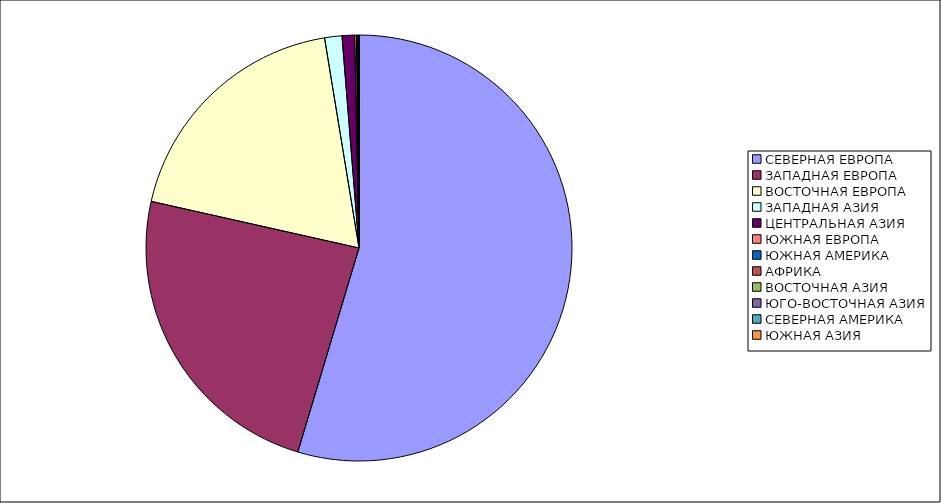
| Category | Оборот |
|---|---|
| СЕВЕРНАЯ ЕВРОПА | 54.639 |
| ЗАПАДНАЯ ЕВРОПА | 23.873 |
| ВОСТОЧНАЯ ЕВРОПА | 18.898 |
| ЗАПАДНАЯ АЗИЯ | 1.316 |
| ЦЕНТРАЛЬНАЯ АЗИЯ | 0.947 |
| ЮЖНАЯ ЕВРОПА | 0.142 |
| ЮЖНАЯ АМЕРИКА | 0.089 |
| АФРИКА | 0.053 |
| ВОСТОЧНАЯ АЗИЯ | 0.042 |
| ЮГО-ВОСТОЧНАЯ АЗИЯ | 0 |
| СЕВЕРНАЯ АМЕРИКА | 0 |
| ЮЖНАЯ АЗИЯ | 0 |